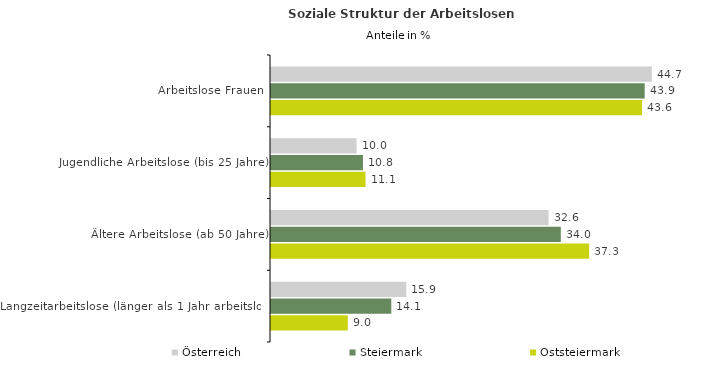
| Category | Österreich | Steiermark | Oststeiermark |
|---|---|---|---|
| Arbeitslose Frauen | 44.699 | 43.86 | 43.553 |
| Jugendliche Arbeitslose (bis 25 Jahre) | 10.046 | 10.794 | 11.095 |
| Ältere Arbeitslose (ab 50 Jahre) | 32.578 | 34.015 | 37.349 |
| Langzeitarbeitslose (länger als 1 Jahr arbeitslos) | 15.879 | 14.12 | 9.009 |